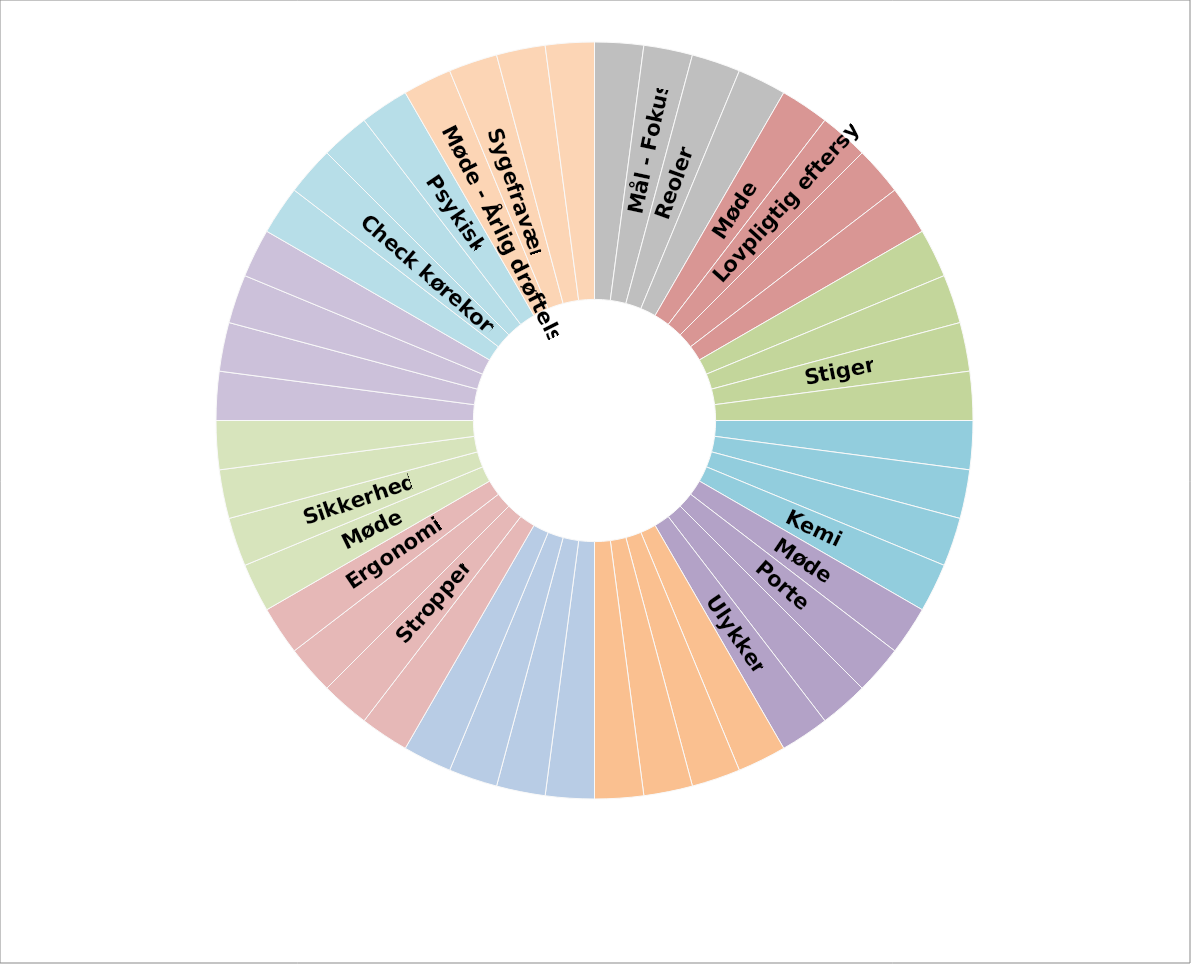
| Category | Series 0 |
|---|---|
|  | 10 |
| Mål - Fokus | 10 |
| Reoler | 10 |
|  | 10 |
| Møde | 10 |
| Lovpligtig eftersyn | 10 |
|  | 10 |
|  | 10 |
|  | 10 |
|  | 10 |
| Stiger | 10 |
|  | 10 |
|  | 10 |
|  | 10 |
|  | 10 |
| Kemi  | 10 |
| Møde | 10 |
| Porte | 10 |
|  | 10 |
| Ulykker | 10 |
|  | 10 |
|  | 10 |
|  | 10 |
|  | 10 |
|  | 10 |
|  | 10 |
|  | 10 |
|  | 10 |
|  | 10 |
| Stropper | 10 |
|  | 10 |
| Ergonomi | 10 |
| Møde | 10 |
| Sikkerhed | 10 |
|  | 10 |
|  | 10 |
|  | 10 |
|  | 10 |
|  | 10 |
|  | 10 |
|  | 10 |
| Check kørekort | 10 |
|  | 10 |
| Psykisk | 10 |
| Møde - Årlig drøftelse | 10 |
| Sygefravær | 10 |